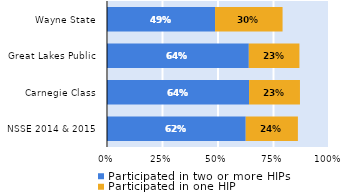
| Category | Participated in two or more HIPs | Participated in one HIP |
|---|---|---|
| NSSE 2014 & 2015 | 0.625 | 0.235 |
| Carnegie Class | 0.64 | 0.229 |
| Great Lakes Public | 0.639 | 0.228 |
| Wayne State | 0.487 | 0.304 |